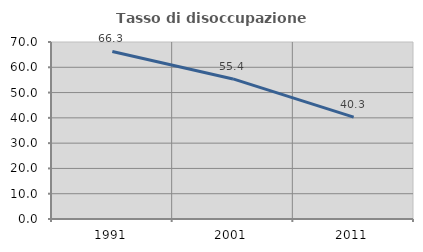
| Category | Tasso di disoccupazione giovanile  |
|---|---|
| 1991.0 | 66.27 |
| 2001.0 | 55.391 |
| 2011.0 | 40.268 |